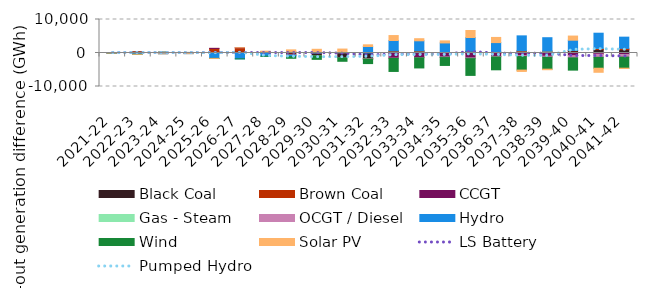
| Category | Black Coal | Brown Coal | CCGT | Gas - Steam | OCGT / Diesel | Hydro | Wind | Solar PV |
|---|---|---|---|---|---|---|---|---|
| 2021-22 | 1.523 | 0 | 0 | 0 | 0 | -2.144 | 0 | 0 |
| 2022-23 | 327.566 | 0.105 | 0 | 0 | -0.008 | -378.448 | 0 | 0 |
| 2023-24 | 227.373 | -4.664 | 0 | 0 | -0.001 | -241.516 | 0.044 | 0 |
| 2024-25 | 144.362 | 16.982 | -0.096 | 0 | -0.055 | -191.358 | 1.751 | 0 |
| 2025-26 | 453.662 | 919.247 | 0.299 | 0 | -0.742 | -1613.367 | -2.137 | 0 |
| 2026-27 | 499.727 | 1072.139 | 0.071 | 0 | -0.603 | -1746.828 | -1.128 | 0 |
| 2027-28 | 78.289 | 390.257 | -5.642 | 0 | -18.769 | -918.032 | -42.719 | 50.262 |
| 2028-29 | -629.335 | 464.353 | -14.54 | 0 | -28.056 | -419.394 | -488.42 | 475.899 |
| 2029-30 | -753.2 | -45.096 | -0.991 | 0 | -17.497 | 84.523 | -1081.36 | 1021.977 |
| 2030-31 | -1311.095 | 63.796 | -24.056 | 0 | -57.684 | 72.708 | -1082.664 | 1041.132 |
| 2031-32 | -1715.694 | -48.325 | -38.903 | -22.711 | -13.951 | 1934.929 | -1320.324 | 508.485 |
| 2032-33 | 506.642 | 176.779 | -1519.496 | 0.627 | -84.04 | 3049.088 | -3901.926 | 1476.294 |
| 2033-34 | 499.787 | 178.15 | -1358.848 | 4.669 | -77.243 | 2960.939 | -3023.193 | 624.285 |
| 2034-35 | 139.642 | 9.945 | -1234.049 | -36.792 | -87.269 | 2854.267 | -2357.178 | 612.103 |
| 2035-36 | 478.969 | 37.748 | -1535.681 | -3.686 | -143.557 | 4113.61 | -5005.267 | 2091.382 |
| 2036-37 | 313.287 | -160.321 | -870.739 | -23.973 | -139.197 | 2797.932 | -3822.034 | 1535 |
| 2037-38 | 334.328 | 360.078 | -772.8 | 3.24 | -287.855 | 4416.428 | -4033.194 | -411.425 |
| 2038-39 | 314.845 | 281.296 | -942.512 | 22.076 | -322.836 | 3945.938 | -3556.925 | -167.385 |
| 2039-40 | 655.354 | 133.416 | -767.578 | 10.659 | -685.603 | 3020.397 | -3660.074 | 1235.434 |
| 2040-41 | 1030.696 | 350.077 | -345.669 | 6.381 | -936.222 | 4520.947 | -3259.956 | -1214.724 |
| 2041-42 | 1002.819 | 372.817 | -521.014 | -2.725 | -696.606 | 3353.248 | -3312.31 | -93.459 |